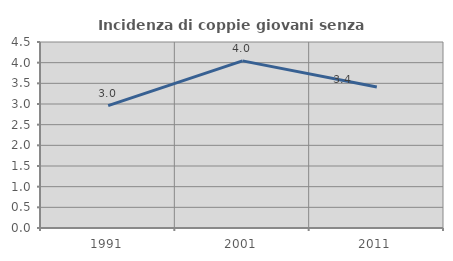
| Category | Incidenza di coppie giovani senza figli |
|---|---|
| 1991.0 | 2.962 |
| 2001.0 | 4.044 |
| 2011.0 | 3.412 |